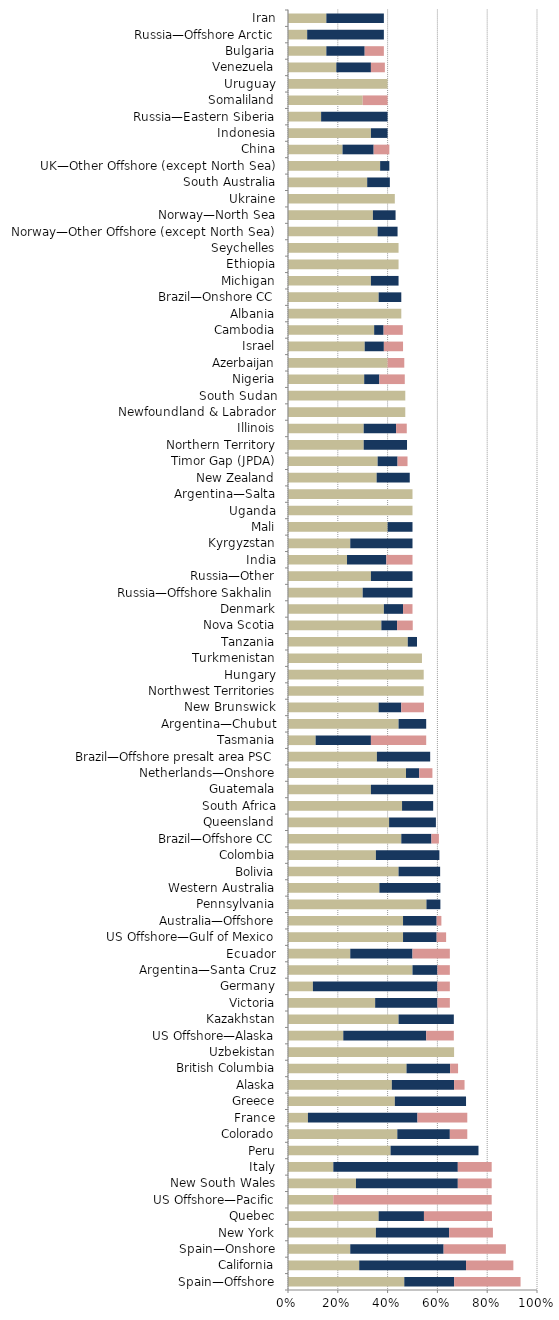
| Category |   Mild deterrent to investment |   Strong deterrent to investment |   Would not pursue investment due to this factor |
|---|---|---|---|
| Spain—Offshore | 0.467 | 0.2 | 0.267 |
| California | 0.286 | 0.429 | 0.19 |
| Spain—Onshore | 0.25 | 0.375 | 0.25 |
| New York | 0.353 | 0.294 | 0.176 |
| Quebec | 0.364 | 0.182 | 0.273 |
| US Offshore—Pacific | 0.182 | 0 | 0.636 |
| New South Wales | 0.273 | 0.409 | 0.136 |
| Italy | 0.182 | 0.5 | 0.136 |
| Peru | 0.412 | 0.353 | 0 |
| Colorado | 0.439 | 0.211 | 0.07 |
| France | 0.08 | 0.44 | 0.2 |
| Greece | 0.429 | 0.286 | 0 |
| Alaska | 0.417 | 0.25 | 0.042 |
| British Columbia | 0.476 | 0.175 | 0.032 |
| Uzbekistan | 0.667 | 0 | 0 |
| US Offshore—Alaska | 0.222 | 0.333 | 0.111 |
| Kazakhstan | 0.444 | 0.222 | 0 |
| Victoria | 0.35 | 0.25 | 0.05 |
| Germany | 0.1 | 0.5 | 0.05 |
| Argentina—Santa Cruz | 0.5 | 0.1 | 0.05 |
| Ecuador | 0.25 | 0.25 | 0.15 |
| US Offshore—Gulf of Mexico | 0.462 | 0.135 | 0.038 |
| Australia—Offshore | 0.462 | 0.135 | 0.019 |
| Pennsylvania | 0.556 | 0.056 | 0 |
| Western Australia | 0.367 | 0.245 | 0 |
| Bolivia | 0.444 | 0.167 | 0 |
| Colombia | 0.353 | 0.255 | 0 |
| Brazil—Offshore CC | 0.455 | 0.121 | 0.03 |
| Queensland | 0.406 | 0.188 | 0 |
| South Africa | 0.458 | 0.125 | 0 |
| Guatemala | 0.333 | 0.25 | 0 |
| Netherlands—Onshore | 0.474 | 0.053 | 0.053 |
| Brazil—Offshore presalt area PSC | 0.357 | 0.214 | 0 |
| Tasmania | 0.111 | 0.222 | 0.222 |
| Argentina—Chubut | 0.444 | 0.111 | 0 |
| New Brunswick | 0.364 | 0.091 | 0.091 |
| Northwest Territories | 0.545 | 0 | 0 |
| Hungary | 0.545 | 0 | 0 |
| Turkmenistan | 0.538 | 0 | 0 |
| Tanzania | 0.481 | 0.037 | 0 |
| Nova Scotia | 0.375 | 0.063 | 0.063 |
| Denmark | 0.385 | 0.077 | 0.038 |
| Russia—Offshore Sakhalin | 0.3 | 0.2 | 0 |
| Russia—Other | 0.333 | 0.167 | 0 |
| India | 0.237 | 0.158 | 0.105 |
| Kyrgyzstan | 0.25 | 0.25 | 0 |
| Mali | 0.4 | 0.1 | 0 |
| Uganda | 0.5 | 0 | 0 |
| Argentina—Salta | 0.5 | 0 | 0 |
| New Zealand | 0.356 | 0.133 | 0 |
| Timor Gap (JPDA) | 0.36 | 0.08 | 0.04 |
| Northern Territory | 0.304 | 0.174 | 0 |
| Illinois | 0.304 | 0.13 | 0.043 |
| Newfoundland & Labrador | 0.471 | 0 | 0 |
| South Sudan | 0.471 | 0 | 0 |
| Nigeria | 0.306 | 0.061 | 0.102 |
| Azerbaijan | 0.4 | 0 | 0.067 |
| Israel | 0.308 | 0.077 | 0.077 |
| Cambodia | 0.346 | 0.038 | 0.077 |
| Albania | 0.455 | 0 | 0 |
| Brazil—Onshore CC | 0.364 | 0.091 | 0 |
| Michigan | 0.333 | 0.111 | 0 |
| Ethiopia | 0.444 | 0 | 0 |
| Seychelles | 0.444 | 0 | 0 |
| Norway—Other Offshore (except North Sea) | 0.36 | 0.08 | 0 |
| Norway—North Sea | 0.341 | 0.091 | 0 |
| Ukraine | 0.429 | 0 | 0 |
| South Australia | 0.318 | 0.091 | 0 |
| UK—Other Offshore (except North Sea) | 0.37 | 0.037 | 0 |
| China | 0.219 | 0.125 | 0.063 |
| Indonesia | 0.333 | 0.067 | 0 |
| Russia—Eastern Siberia | 0.133 | 0.267 | 0 |
| Somaliland | 0.3 | 0 | 0.1 |
| Uruguay | 0.4 | 0 | 0 |
| Venezuela | 0.194 | 0.139 | 0.056 |
| Bulgaria | 0.154 | 0.154 | 0.077 |
| Russia—Offshore Arctic | 0.077 | 0.308 | 0 |
| Iran | 0.154 | 0.231 | 0 |